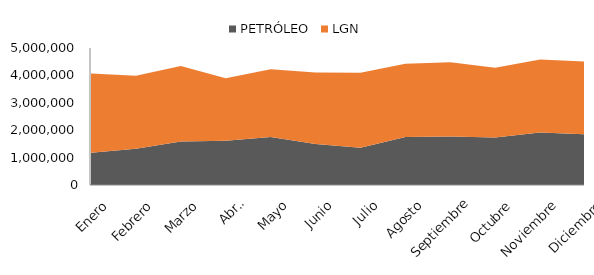
| Category | PETRÓLEO | LGN |
|---|---|---|
| Enero | 1176474 | 2893508 |
| Febrero | 1319470 | 2670225 |
| Marzo | 1591999 | 2750919 |
| Abril | 1613016 | 2283124 |
| Mayo | 1753827 | 2468624 |
| Junio | 1499642 | 2609520 |
| Julio | 1361416 | 2732646 |
| Agosto | 1747481 | 2673826 |
| Septiembre | 1774539 | 2707200 |
| Octubre | 1737369 | 2542773 |
| Noviembre | 1912149 | 2669142 |
| Diciembre | 1851687 | 2657653 |